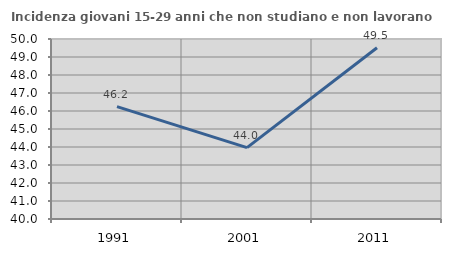
| Category | Incidenza giovani 15-29 anni che non studiano e non lavorano  |
|---|---|
| 1991.0 | 46.245 |
| 2001.0 | 43.966 |
| 2011.0 | 49.515 |